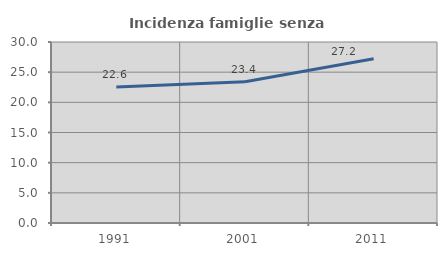
| Category | Incidenza famiglie senza nuclei |
|---|---|
| 1991.0 | 22.554 |
| 2001.0 | 23.409 |
| 2011.0 | 27.221 |